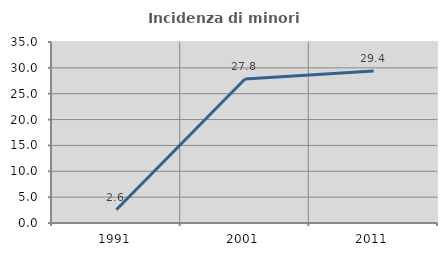
| Category | Incidenza di minori stranieri |
|---|---|
| 1991.0 | 2.564 |
| 2001.0 | 27.848 |
| 2011.0 | 29.375 |